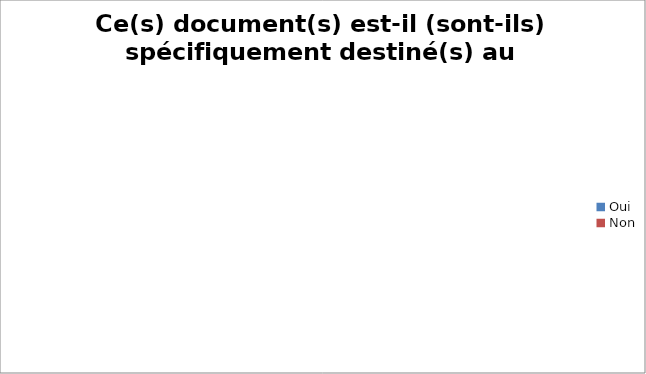
| Category | Ce(s) document(s) est-il (sont-ils) spécifiquement destinés au patient : |
|---|---|
| Oui | 0 |
| Non | 0 |